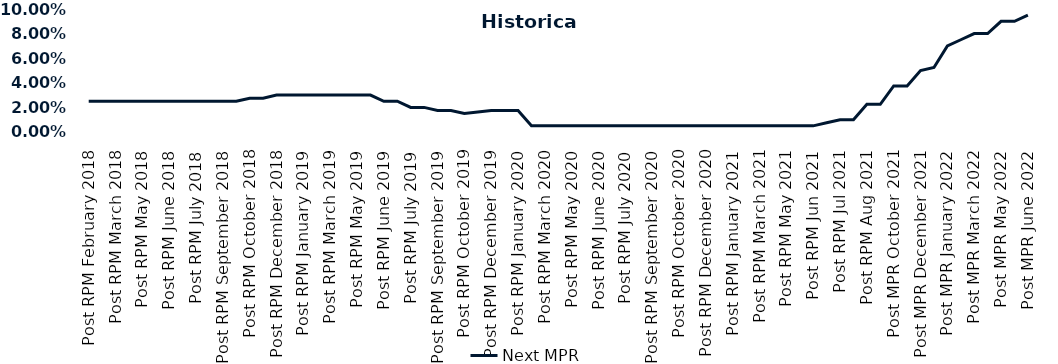
| Category | Next MPR |
|---|---|
| Post RPM February 2018 | 0.025 |
| Pre RPM March 2018 | 0.025 |
| Post RPM March 2018 | 0.025 |
| Pre RPM May 2018 | 0.025 |
| Post RPM May 2018 | 0.025 |
| Pre RPM June 2018 | 0.025 |
| Post RPM June 2018 | 0.025 |
| Pre RPM July 2018 | 0.025 |
| Post RPM July 2018 | 0.025 |
| Pre RPM September 2018 | 0.025 |
| Post RPM September 2018 | 0.025 |
| Pre RPM October 2018 | 0.025 |
| Post RPM October 2018 | 0.028 |
| Pre RPM December 2018 | 0.028 |
| Post RPM December 2018 | 0.03 |
| Pre RPM January 2019 | 0.03 |
| Post RPM January 2019 | 0.03 |
| Pre RPM March 2019 | 0.03 |
| Post RPM March 2019 | 0.03 |
| Pre RPM May 2019 | 0.03 |
| Post RPM May 2019 | 0.03 |
| Pre RPM June 2019 | 0.03 |
| Post RPM June 2019 | 0.025 |
| Pre RPM July 2019 | 0.025 |
| Post RPM July 2019 | 0.02 |
| Pre RPM September 2019 | 0.02 |
| Post RPM September 2019 | 0.018 |
| Pre RPM October 2019 | 0.018 |
| Post RPM October 2019 | 0.015 |
| Pre RPM December 2019 | 0.016 |
| Post RPM December 2019 | 0.018 |
| Pre RPM January 2020 | 0.018 |
| Post RPM January 2020 | 0.018 |
| Pre RPM March 2020 | 0.005 |
| Post RPM March 2020 | 0.005 |
| Pre RPM May 2020 | 0.005 |
| Post RPM May 2020 | 0.005 |
| Pre RPM June 2020 | 0.005 |
| Post RPM June 2020 | 0.005 |
| Pre RPM July 2020 | 0.005 |
| Post RPM July 2020 | 0.005 |
| Pre RPM September 2020 | 0.005 |
| Post RPM September 2020 | 0.005 |
| Pre RPM October 2020 | 0.005 |
| Post RPM October 2020 | 0.005 |
| Pre RPM December 2020 | 0.005 |
|  Post RPM December 2020 | 0.005 |
| Pre RPM January 2021 | 0.005 |
| Post RPM January 2021 | 0.005 |
|  Pre RPM March 2021 | 0.005 |
|  Post RPM March 2021 | 0.005 |
|  Pre RPM May 2021 | 0.005 |
|  Post RPM May 2021 | 0.005 |
|  Pre RPM Jun 2021 | 0.005 |
|   Post RPM Jun 2021 | 0.005 |
| Pre RPM Jul 2021 | 0.008 |
|  Post RPM Jul 2021 | 0.01 |
| Pre RPM Aug 2021 | 0.01 |
|  Post RPM Aug 2021 | 0.022 |
| Pre MPR October 2021 | 0.022 |
| Post MPR October 2021 | 0.038 |
| Pre MPR December 2021 | 0.038 |
| Post MPR December 2021 | 0.05 |
| Pre MPR January 2022 | 0.052 |
| Post MPR January 2022 | 0.07 |
| Pre MPR March 2022 | 0.075 |
| Post MPR March 2022 | 0.08 |
| Pre MPR May 2022 | 0.08 |
| Post MPR May 2022 | 0.09 |
| Pre MPR June 2022 | 0.09 |
| Post MPR June 2022 | 0.095 |